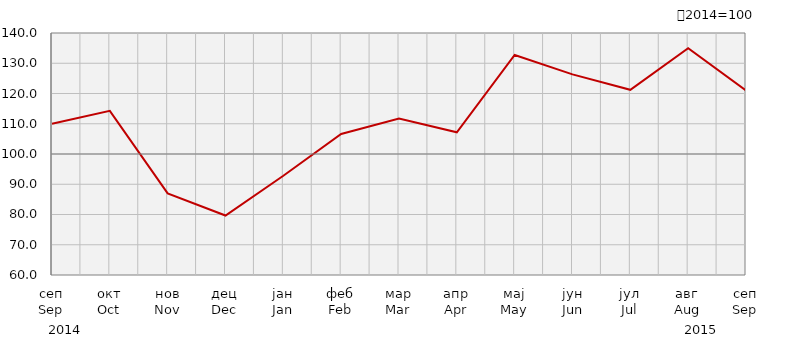
| Category | Индекси ноћења туриста
Tourist night indices |
|---|---|
| сеп
Sep | 110.023 |
| окт
Oct | 114.25 |
| нов
Nov | 86.993 |
| дец
Dec | 79.66 |
| јан
Jan | 92.8 |
| феб
Feb | 106.635 |
| мар
Mar | 111.734 |
| апр
Apr | 107.182 |
| мај
May | 132.731 |
| јун
Jun | 126.332 |
| јул
Jul | 121.211 |
| авг
Aug | 134.96 |
| сеп
Sep | 121.017 |